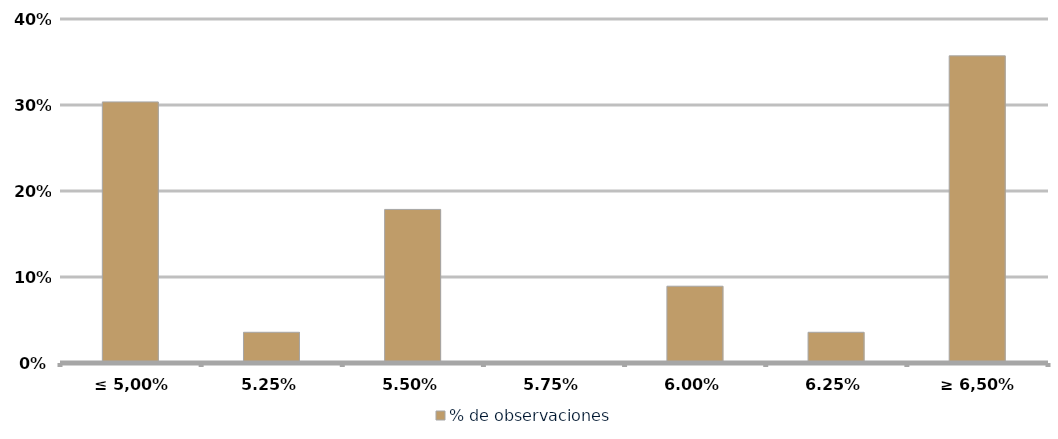
| Category | % de observaciones  |
|---|---|
| ≤ 5,00% | 0.304 |
| 5,25% | 0.036 |
| 5,50% | 0.179 |
| 5,75% | 0 |
| 6,00% | 0.089 |
| 6,25% | 0.036 |
| ≥ 6,50% | 0.357 |